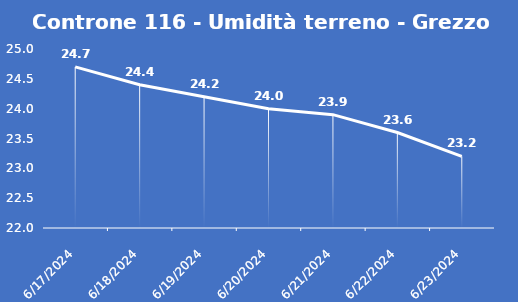
| Category | Controne 116 - Umidità terreno - Grezzo (%VWC) |
|---|---|
| 6/17/24 | 24.7 |
| 6/18/24 | 24.4 |
| 6/19/24 | 24.2 |
| 6/20/24 | 24 |
| 6/21/24 | 23.9 |
| 6/22/24 | 23.6 |
| 6/23/24 | 23.2 |